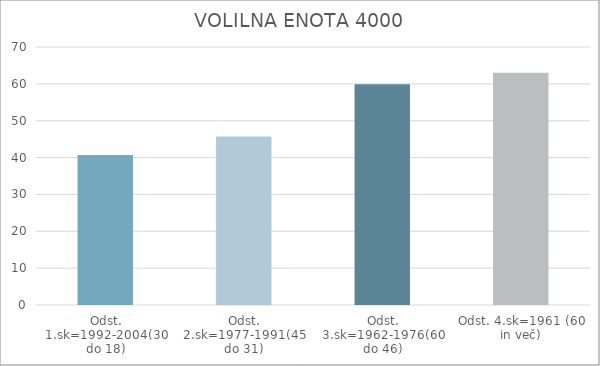
| Category | Series 0 |
|---|---|
| Odst. 1.sk=1992-2004(30 do 18) | 40.68 |
| Odst. 2.sk=1977-1991(45 do 31) | 45.7 |
| Odst. 3.sk=1962-1976(60 do 46) | 59.88 |
| Odst. 4.sk=1961 (60 in več) | 62.98 |